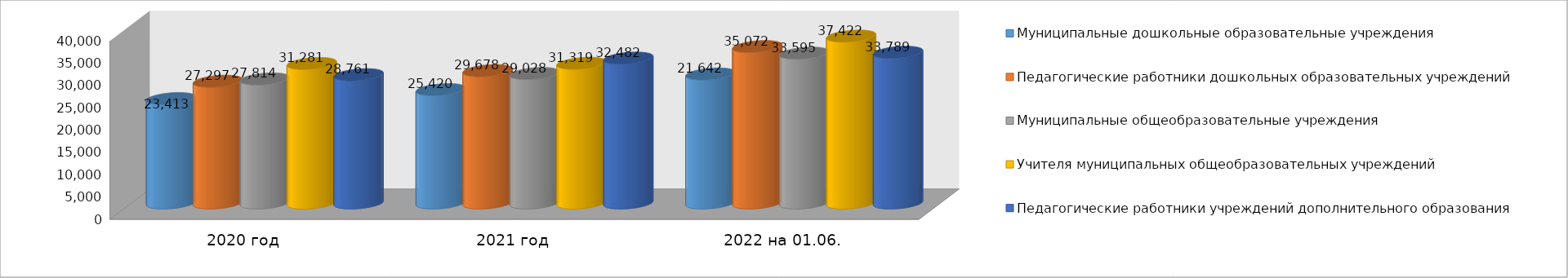
| Category | Муниципальные дошкольные образовательные учреждения | Педагогические работники дошкольных образовательных учреждений | Муниципальные общеобразовательные учреждения | Учителя муниципальных общеобразовательных учреждений | Педагогические работники учреждений дополнительного образования |
|---|---|---|---|---|---|
| 2020 год | 23413 | 27297 | 27814 | 31281 | 28761 |
| 2021 год | 25420 | 29678 | 29028 | 31319 | 32482 |
| 2022 на 01.06. | 28928 | 35072 | 33595 | 37422 | 33789 |